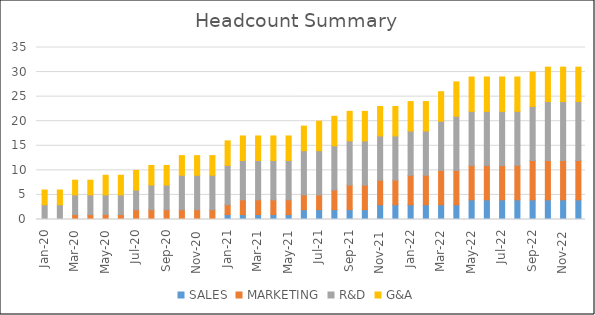
| Category | SALES | MARKETING | R&D | G&A |
|---|---|---|---|---|
| 2020-01-01 | 0 | 0 | 3 | 3 |
| 2020-02-29 | 0 | 0 | 3 | 3 |
| 2020-03-31 | 0 | 1 | 4 | 3 |
| 2020-04-30 | 0 | 1 | 4 | 3 |
| 2020-05-31 | 0 | 1 | 4 | 4 |
| 2020-06-30 | 0 | 1 | 4 | 4 |
| 2020-07-31 | 0 | 2 | 4 | 4 |
| 2020-08-31 | 0 | 2 | 5 | 4 |
| 2020-09-30 | 0 | 2 | 5 | 4 |
| 2020-10-31 | 0 | 2 | 7 | 4 |
| 2020-11-30 | 0 | 2 | 7 | 4 |
| 2020-12-31 | 0 | 2 | 7 | 4 |
| 2021-01-31 | 1 | 2 | 8 | 5 |
| 2021-02-28 | 1 | 3 | 8 | 5 |
| 2021-03-31 | 1 | 3 | 8 | 5 |
| 2021-04-30 | 1 | 3 | 8 | 5 |
| 2021-05-31 | 1 | 3 | 8 | 5 |
| 2021-06-30 | 2 | 3 | 9 | 5 |
| 2021-07-31 | 2 | 3 | 9 | 6 |
| 2021-08-31 | 2 | 4 | 9 | 6 |
| 2021-09-30 | 2 | 5 | 9 | 6 |
| 2021-10-31 | 2 | 5 | 9 | 6 |
| 2021-11-30 | 3 | 5 | 9 | 6 |
| 2021-12-31 | 3 | 5 | 9 | 6 |
| 2022-01-31 | 3 | 6 | 9 | 6 |
| 2022-02-28 | 3 | 6 | 9 | 6 |
| 2022-03-31 | 3 | 7 | 10 | 6 |
| 2022-04-30 | 3 | 7 | 11 | 7 |
| 2022-05-31 | 4 | 7 | 11 | 7 |
| 2022-06-30 | 4 | 7 | 11 | 7 |
| 2022-07-31 | 4 | 7 | 11 | 7 |
| 2022-08-31 | 4 | 7 | 11 | 7 |
| 2022-09-30 | 4 | 8 | 11 | 7 |
| 2022-10-31 | 4 | 8 | 12 | 7 |
| 2022-11-30 | 4 | 8 | 12 | 7 |
| 2022-12-31 | 4 | 8 | 12 | 7 |